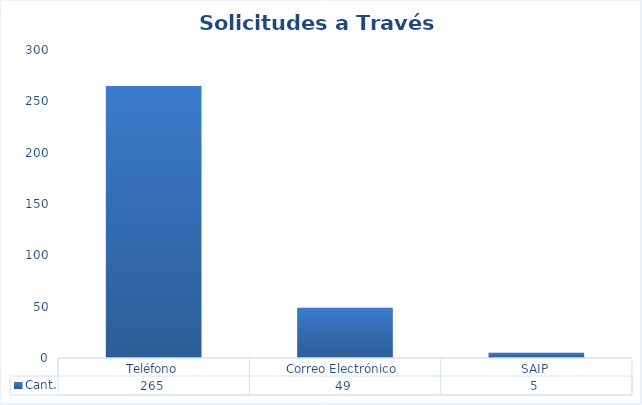
| Category | Cant. |
|---|---|
| Teléfono | 265 |
| Correo Electrónico  | 49 |
| SAIP | 5 |